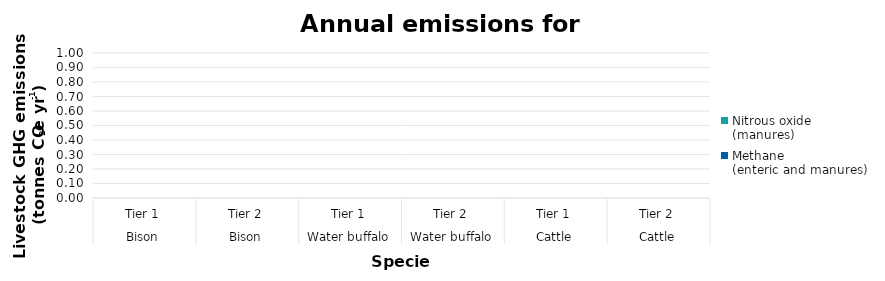
| Category | Methane 
(enteric and manures) | Nitrous oxide 
(manures) |
|---|---|---|
| 0 | 0 | 0 |
| 1 | 0 | 0 |
| 2 | 0 | 0 |
| 3 | 0 | 0 |
| 4 | 0 | 0 |
| 5 | 0 | 0 |